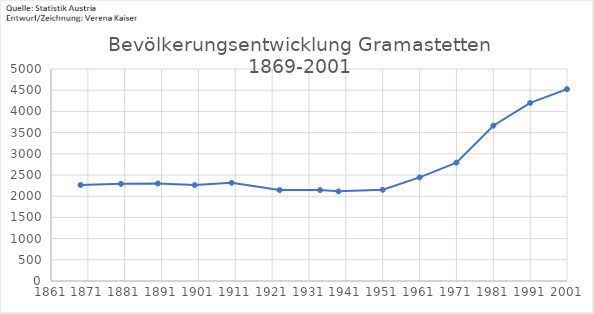
| Category | Anzahl |
|---|---|
| 2001.0 | 4525 |
| 1991.0 | 4201 |
| 1981.0 | 3663 |
| 1971.0 | 2792 |
| 1961.0 | 2443 |
| 1951.0 | 2151 |
| 1939.0 | 2114 |
| 1934.0 | 2145 |
| 1923.0 | 2144 |
| 1910.0 | 2316 |
| 1900.0 | 2262 |
| 1890.0 | 2300 |
| 1880.0 | 2291 |
| 1869.0 | 2265 |